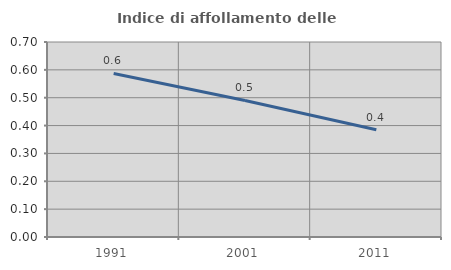
| Category | Indice di affollamento delle abitazioni  |
|---|---|
| 1991.0 | 0.587 |
| 2001.0 | 0.49 |
| 2011.0 | 0.385 |